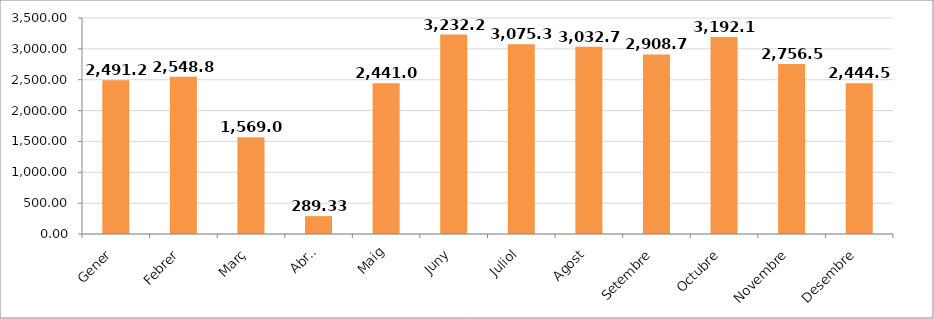
| Category | Series 25 |
|---|---|
| Gener | 2491.249 |
| Febrer | 2548.797 |
| Març | 1569.068 |
| Abril | 289.327 |
| Maig | 2441.04 |
| Juny | 3232.237 |
| Juliol | 3075.339 |
| Agost | 3032.702 |
| Setembre | 2908.7 |
| Octubre | 3192.151 |
| Novembre | 2756.506 |
| Desembre | 2444.553 |